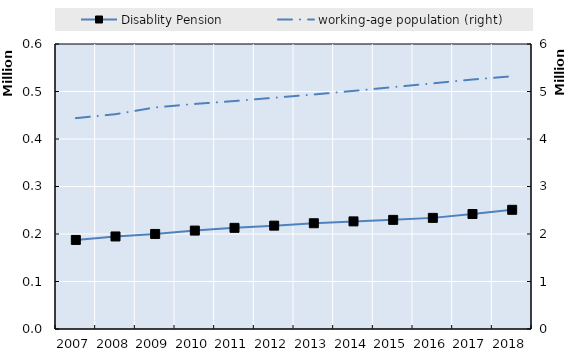
| Category | Disablity Pension | Series 4 | Series 5 | Series 6 | Series 7 | Series 8 | Series 9 | Series 10 | Series 11 | Series 12 | Series 13 | Series 14 | Series 15 | Series 16 | Series 17 | Series 18 | Series 19 |
|---|---|---|---|---|---|---|---|---|---|---|---|---|---|---|---|---|---|
| 2007.0 | 187525 |  |  |  |  |  |  |  |  |  |  |  |  |  |  |  |  |
| 2008.0 | 194820 |  |  |  |  |  |  |  |  |  |  |  |  |  |  |  |  |
| 2009.0 | 200115 |  |  |  |  |  |  |  |  |  |  |  |  |  |  |  |  |
| 2010.0 | 207174 |  |  |  |  |  |  |  |  |  |  |  |  |  |  |  |  |
| 2011.0 | 212951 |  |  |  |  |  |  |  |  |  |  |  |  |  |  |  |  |
| 2012.0 | 217589 |  |  |  |  |  |  |  |  |  |  |  |  |  |  |  |  |
| 2013.0 | 222641 |  |  |  |  |  |  |  |  |  |  |  |  |  |  |  |  |
| 2014.0 | 226552 |  |  |  |  |  |  |  |  |  |  |  |  |  |  |  |  |
| 2015.0 | 229745 |  |  |  |  |  |  |  |  |  |  |  |  |  |  |  |  |
| 2016.0 | 233945 |  |  |  |  |  |  |  |  |  |  |  |  |  |  |  |  |
| 2017.0 | 242100 |  |  |  |  |  |  |  |  |  |  |  |  |  |  |  |  |
| 2018.0 | 250902 |  |  |  |  |  |  |  |  |  |  |  |  |  |  |  |  |